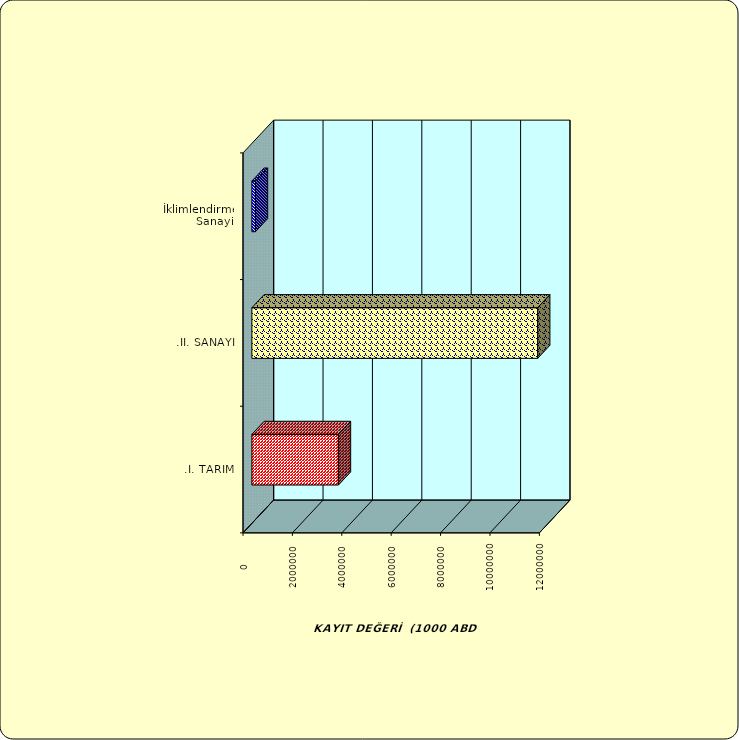
| Category | Series 0 |
|---|---|
| .I. TARIM | 3504834.71 |
| .II. SANAYİ | 11572518.715 |
|  İklimlendirme Sanayii | 143960.447 |